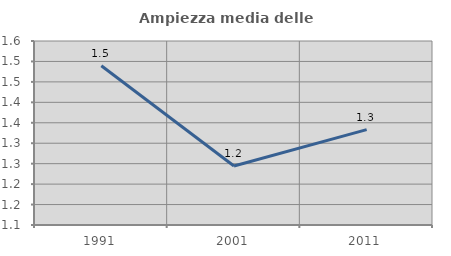
| Category | Ampiezza media delle famiglie |
|---|---|
| 1991.0 | 1.489 |
| 2001.0 | 1.244 |
| 2011.0 | 1.333 |